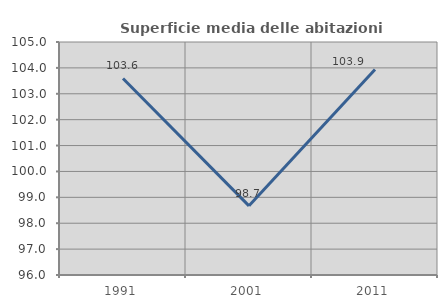
| Category | Superficie media delle abitazioni occupate |
|---|---|
| 1991.0 | 103.591 |
| 2001.0 | 98.672 |
| 2011.0 | 103.936 |